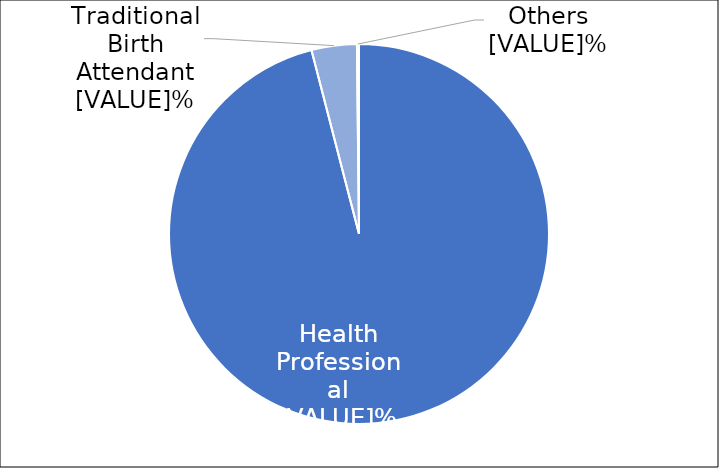
| Category | Series 0 |
|---|---|
|  Health Professional  | 95.97 |
|  Traditional Birth Attendant  | 3.853 |
|  Others  | 0.175 |